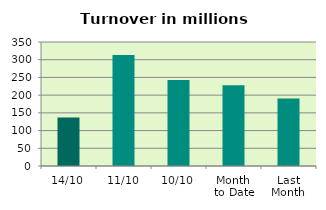
| Category | Series 0 |
|---|---|
| 14/10 | 136.994 |
| 11/10 | 313.595 |
| 10/10 | 242.561 |
| Month 
to Date | 228.066 |
| Last
Month | 190.73 |